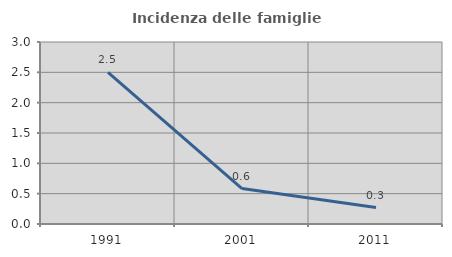
| Category | Incidenza delle famiglie numerose |
|---|---|
| 1991.0 | 2.5 |
| 2001.0 | 0.585 |
| 2011.0 | 0.272 |